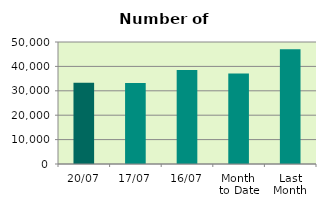
| Category | Series 0 |
|---|---|
| 20/07 | 33330 |
| 17/07 | 33244 |
| 16/07 | 38556 |
| Month 
to Date | 37041.857 |
| Last
Month | 46980.273 |